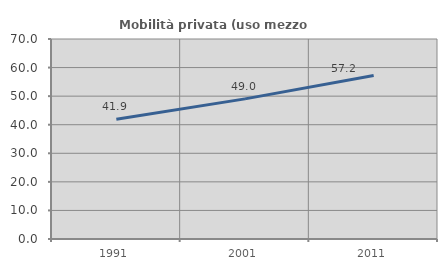
| Category | Mobilità privata (uso mezzo privato) |
|---|---|
| 1991.0 | 41.9 |
| 2001.0 | 49.037 |
| 2011.0 | 57.194 |